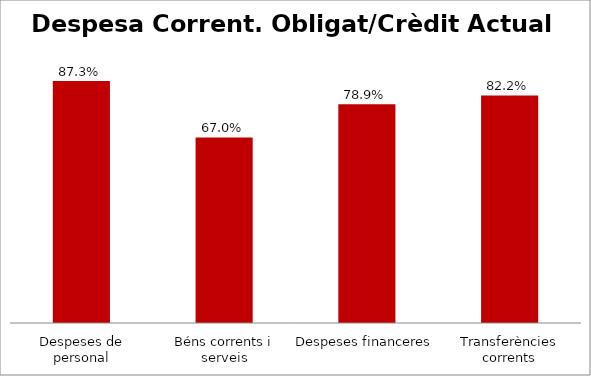
| Category | Series 0 |
|---|---|
| Despeses de personal | 0.873 |
| Béns corrents i serveis | 0.67 |
| Despeses financeres | 0.789 |
| Transferències corrents | 0.822 |